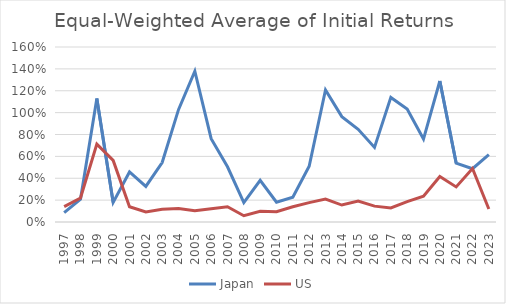
| Category | Japan | US |
|---|---|---|
| 1997.0 | 0.085 | 0.14 |
| 1998.0 | 0.209 | 0.219 |
| 1999.0 | 1.128 | 0.712 |
| 2000.0 | 0.179 | 0.563 |
| 2001.0 | 0.458 | 0.14 |
| 2002.0 | 0.325 | 0.091 |
| 2003.0 | 0.544 | 0.117 |
| 2004.0 | 1.027 | 0.123 |
| 2005.0 | 1.379 | 0.103 |
| 2006.0 | 0.762 | 0.121 |
| 2007.0 | 0.505 | 0.14 |
| 2008.0 | 0.178 | 0.057 |
| 2009.0 | 0.382 | 0.098 |
| 2010.0 | 0.181 | 0.094 |
| 2011.0 | 0.226 | 0.139 |
| 2012.0 | 0.51 | 0.177 |
| 2013.0 | 1.207 | 0.209 |
| 2014.0 | 0.963 | 0.155 |
| 2015.0 | 0.847 | 0.192 |
| 2016.0 | 0.682 | 0.145 |
| 2017.0 | 1.139 | 0.129 |
| 2018.0 | 1.033 | 0.186 |
| 2019.0 | 0.758 | 0.235 |
| 2020.0 | 1.289 | 0.416 |
| 2021.0 | 0.539 | 0.321 |
| 2022.0 | 0.487 | 0.489 |
| 2023.0 | 0.615 | 0.119 |